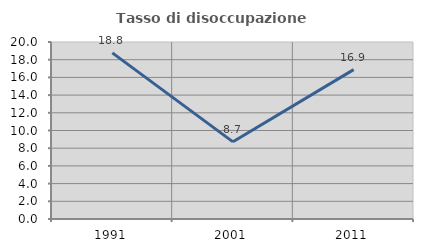
| Category | Tasso di disoccupazione giovanile  |
|---|---|
| 1991.0 | 18.77 |
| 2001.0 | 8.719 |
| 2011.0 | 16.878 |